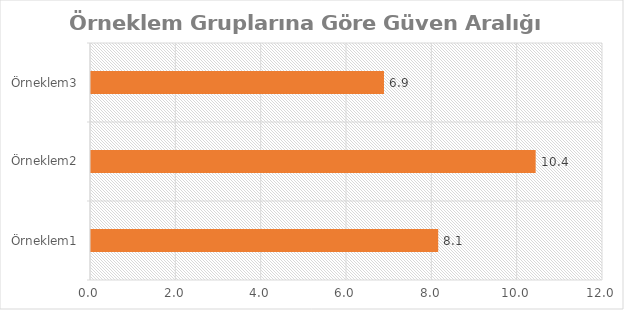
| Category | Series 0 |
|---|---|
| Örneklem1 | 8.138 |
| Örneklem2 | 10.422 |
| Örneklem3 | 6.867 |